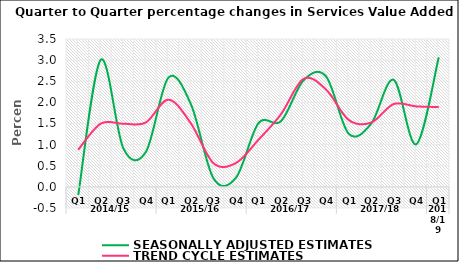
| Category | SEASONALLY ADJUSTED ESTIMATES | TREND CYCLE ESTIMATES |
|---|---|---|
| 0 | -0.19 | 0.878 |
| 1 | 3.007 | 1.497 |
| 2 | 0.914 | 1.494 |
| 3 | 0.826 | 1.525 |
| 4 | 2.584 | 2.064 |
| 5 | 1.957 | 1.502 |
| 6 | 0.204 | 0.562 |
| 7 | 0.218 | 0.565 |
| 8 | 1.508 | 1.116 |
| 9 | 1.556 | 1.721 |
| 10 | 2.522 | 2.556 |
| 11 | 2.613 | 2.305 |
| 12 | 1.26 | 1.585 |
| 13 | 1.494 | 1.521 |
| 14 | 2.534 | 1.96 |
| 15 | 1.008 | 1.905 |
| 16 | 3.065 | 1.89 |